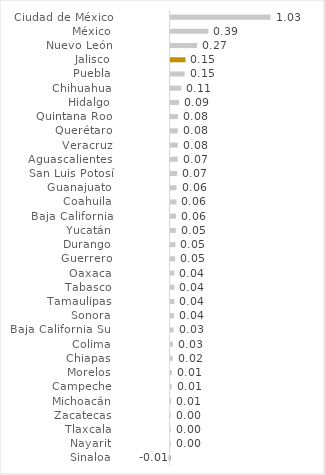
| Category | Series 0 |
|---|---|
| Sinaloa | -0.008 |
| Nayarit | 0.002 |
| Tlaxcala | 0.002 |
| Zacatecas | 0.003 |
| Michoacán | 0.007 |
| Campeche | 0.012 |
| Morelos | 0.014 |
| Chiapas | 0.021 |
| Colima | 0.025 |
| Baja California Sur | 0.032 |
| Sonora | 0.037 |
| Tamaulipas | 0.04 |
| Tabasco | 0.04 |
| Oaxaca | 0.041 |
| Guerrero | 0.048 |
| Durango | 0.05 |
| Yucatán | 0.055 |
| Baja California | 0.056 |
| Coahuila | 0.062 |
| Guanajuato | 0.062 |
| San Luis Potosí | 0.069 |
| Aguascalientes | 0.075 |
| Veracruz | 0.075 |
| Querétaro | 0.076 |
| Quintana Roo | 0.077 |
| Hidalgo | 0.087 |
| Chihuahua | 0.111 |
| Puebla | 0.145 |
| Jalisco | 0.154 |
| Nuevo León | 0.274 |
| México | 0.39 |
| Ciudad de México | 1.031 |